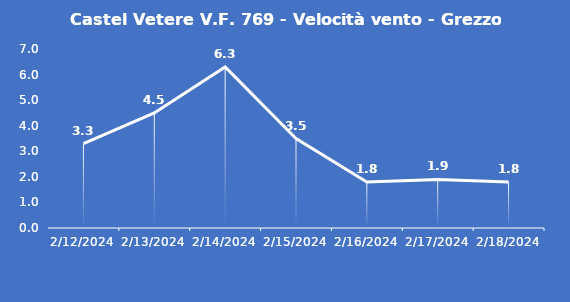
| Category | Castel Vetere V.F. 769 - Velocità vento - Grezzo (m/s) |
|---|---|
| 2/12/24 | 3.3 |
| 2/13/24 | 4.5 |
| 2/14/24 | 6.3 |
| 2/15/24 | 3.5 |
| 2/16/24 | 1.8 |
| 2/17/24 | 1.9 |
| 2/18/24 | 1.8 |